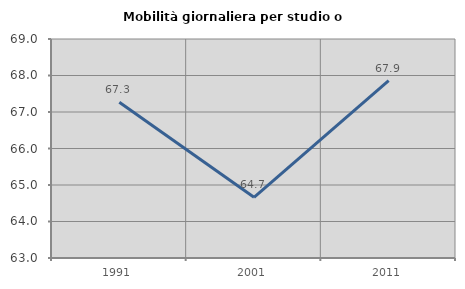
| Category | Mobilità giornaliera per studio o lavoro |
|---|---|
| 1991.0 | 67.266 |
| 2001.0 | 64.664 |
| 2011.0 | 67.86 |